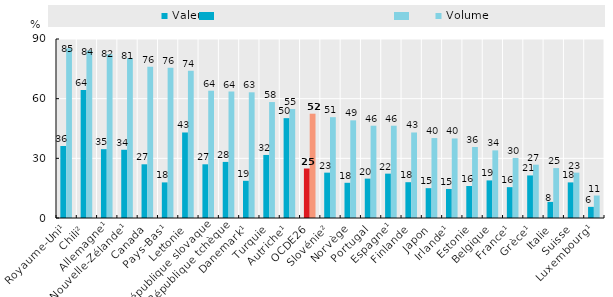
| Category | Valeur | Volume |
|---|---|---|
| Royaume-Uni¹ | 36.2 | 85.3 |
| Chili² | 64.4 | 84.2 |
| Allemagne¹ | 34.6 | 82.3 |
| Nouvelle-Zélande¹ | 34.3 | 80.5 |
| Canada | 27 | 76 |
| Pays-Bas¹ | 17.9 | 75.6 |
| Lettonie | 43 | 74 |
| République slovaque | 27 | 64 |
| République tchèque | 28.2 | 63.6 |
| Danemark¹ | 18.7 | 63.2 |
| Turquie | 31.7 | 58.3 |
| Autriche¹ | 50.2 | 54.8 |
| OCDE26 | 24.881 | 52.442 |
| Slovénie² | 22.8 | 50.7 |
| Norvège | 17.7 | 49.1 |
| Portugal | 19.8 | 46.4 |
| Espagne¹ | 22.3 | 46.4 |
| Finlande | 18 | 43 |
| Japon | 15 | 40.2 |
| Irlande¹ | 14.6 | 40 |
| Estonie | 16.1 | 35.7 |
| Belgique | 18.9 | 34 |
| France¹ | 15.5 | 30.2 |
| Grèce¹ | 21.4 | 26.8 |
| Italie | 8.1 | 25.1 |
| Suisse | 17.9 | 22.8 |
| Luxembourg¹ | 5.6 | 11.3 |